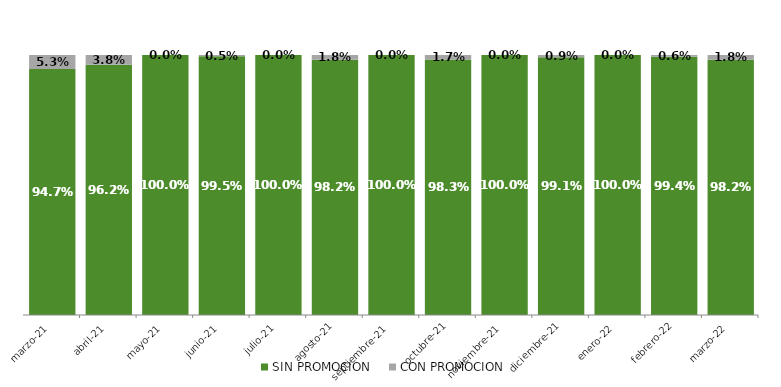
| Category | SIN PROMOCION   | CON PROMOCION   |
|---|---|---|
| 2021-03-01 | 0.947 | 0.053 |
| 2021-04-01 | 0.962 | 0.038 |
| 2021-05-01 | 1 | 0 |
| 2021-06-01 | 0.995 | 0.005 |
| 2021-07-01 | 1 | 0 |
| 2021-08-01 | 0.982 | 0.018 |
| 2021-09-01 | 1 | 0 |
| 2021-10-01 | 0.983 | 0.017 |
| 2021-11-01 | 1 | 0 |
| 2021-12-01 | 0.991 | 0.009 |
| 2022-01-01 | 1 | 0 |
| 2022-02-01 | 0.994 | 0.006 |
| 2022-03-01 | 0.982 | 0.018 |